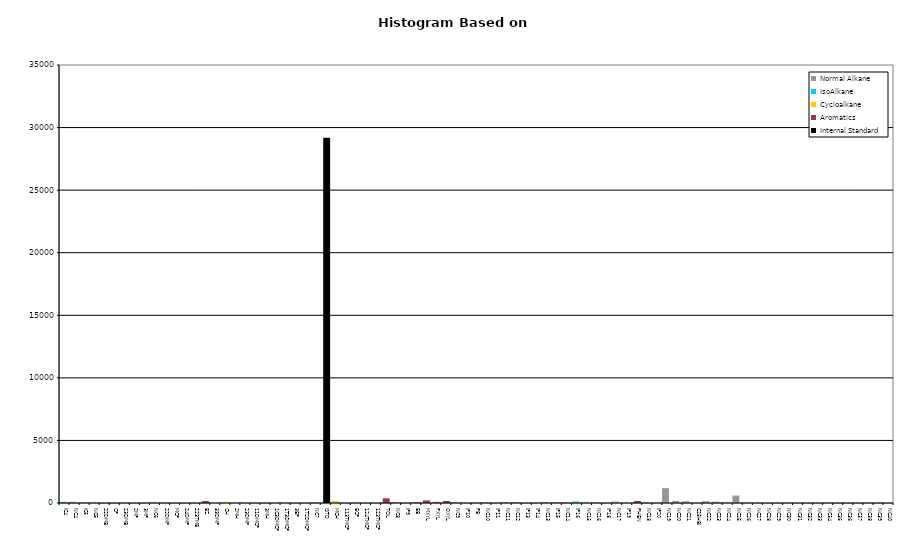
| Category | Normal Alkane | IsoAlkane | Cycloalkane | Aromatics | Internal Standard |
|---|---|---|---|---|---|
| IC4 | 0 | 94 | 0 | 0 | 0 |
| NC4 | 92 | 0 | 0 | 0 | 0 |
| IC5 | 0 | 29 | 0 | 0 | 0 |
| NC5 | 22 | 0 | 0 | 0 | 0 |
| 22DMB | 0 | 0 | 0 | 0 | 0 |
| CP | 0 | 0 | 0 | 0 | 0 |
| 23DMB | 0 | 0 | 0 | 0 | 0 |
| 2MP | 0 | 0 | 0 | 0 | 0 |
| 3MP | 0 | 0 | 0 | 0 | 0 |
| NC6 | 59 | 0 | 0 | 0 | 0 |
| 22DMP | 0 | 0 | 0 | 0 | 0 |
| MCP | 0 | 0 | 47 | 0 | 0 |
| 24DMP | 0 | 0 | 0 | 0 | 0 |
| 223TMB | 0 | 0 | 0 | 0 | 0 |
| BZ | 0 | 0 | 0 | 157 | 0 |
| 33DMP | 0 | 0 | 0 | 0 | 0 |
| CH | 0 | 0 | 96 | 0 | 0 |
| 2MH | 0 | 0 | 0 | 0 | 0 |
| 23DMP | 0 | 0 | 0 | 0 | 0 |
| 11DMCP | 0 | 0 | 0 | 0 | 0 |
| 3MH | 0 | 0 | 0 | 0 | 0 |
| 1C3DMCP | 0 | 0 | 0 | 0 | 0 |
| 1T3DMCP | 0 | 0 | 0 | 0 | 0 |
| 3EP | 0 | 0 | 0 | 0 | 0 |
| 1T2DMCP | 0 | 0 | 0 | 0 | 0 |
| NC7 | 59 | 0 | 0 | 0 | 0 |
| ISTD | 0 | 0 | 0 | 0 | 29191 |
| MCH | 0 | 0 | 152 | 0 | 0 |
| 113TMCP | 0 | 0 | 0 | 0 | 0 |
| ECP | 0 | 0 | 0 | 0 | 0 |
| 124TMCP | 0 | 0 | 0 | 0 | 0 |
| 123TMCP | 0 | 0 | 0 | 0 | 0 |
| TOL | 0 | 0 | 0 | 375 | 0 |
| NC8 | 73 | 0 | 0 | 0 | 0 |
| IP9 | 0 | 0 | 0 | 0 | 0 |
| EB | 0 | 0 | 0 | 55 | 0 |
| MXYL | 0 | 0 | 0 | 206 | 0 |
| PXYL | 0 | 0 | 0 | 83 | 0 |
| OXYL | 0 | 0 | 0 | 161 | 0 |
| NC9 | 71 | 0 | 0 | 0 | 0 |
| IP10 | 0 | 0 | 0 | 0 | 0 |
| PB | 0 | 0 | 0 | 0 | 0 |
| NC10 | 58 | 0 | 0 | 0 | 0 |
| IP11 | 0 | 0 | 0 | 0 | 0 |
| NC11 | 75 | 0 | 0 | 0 | 0 |
| NC12 | 75 | 0 | 0 | 0 | 0 |
| IP13 | 0 | 0 | 0 | 0 | 0 |
| IP14 | 0 | 0 | 0 | 0 | 0 |
| NC13 | 82 | 0 | 0 | 0 | 0 |
| IP15 | 0 | 58 | 0 | 0 | 0 |
| NC14 | 76 | 0 | 0 | 0 | 0 |
| IP16 | 0 | 121 | 0 | 0 | 0 |
| NC15 | 56 | 0 | 0 | 0 | 0 |
| NC16 | 43 | 0 | 0 | 0 | 0 |
| IP18 | 0 | 0 | 0 | 0 | 0 |
| NC17 | 111 | 0 | 0 | 0 | 0 |
| IP19 | 0 | 0 | 0 | 0 | 0 |
| PHEN | 0 | 0 | 0 | 159 | 0 |
| NC18 | 43 | 0 | 0 | 0 | 0 |
| IP20 | 0 | 0 | 0 | 0 | 0 |
| NC19 | 1184 | 0 | 0 | 0 | 0 |
| NC20 | 168 | 0 | 0 | 0 | 0 |
| NC21 | 140 | 0 | 0 | 0 | 0 |
| C25HBI | 0 | 0 | 0 | 0 | 0 |
| NC22 | 145 | 0 | 0 | 0 | 0 |
| NC23 | 106 | 0 | 0 | 0 | 0 |
| NC24 | 37 | 0 | 0 | 0 | 0 |
| NC25 | 596 | 0 | 0 | 0 | 0 |
| NC26 | 0 | 0 | 0 | 0 | 0 |
| NC27 | 0 | 0 | 0 | 0 | 0 |
| NC28 | 0 | 0 | 0 | 0 | 0 |
| NC29 | 0 | 0 | 0 | 0 | 0 |
| NC30 | 0 | 0 | 0 | 0 | 0 |
| NC31 | 0 | 0 | 0 | 0 | 0 |
| NC32 | 0 | 0 | 0 | 0 | 0 |
| NC33 | 0 | 0 | 0 | 0 | 0 |
| NC34 | 0 | 0 | 0 | 0 | 0 |
| NC35 | 0 | 0 | 0 | 0 | 0 |
| NC36 | 0 | 0 | 0 | 0 | 0 |
| NC37 | 0 | 0 | 0 | 0 | 0 |
| NC38 | 0 | 0 | 0 | 0 | 0 |
| NC39 | 0 | 0 | 0 | 0 | 0 |
| NC40 | 0 | 0 | 0 | 0 | 0 |